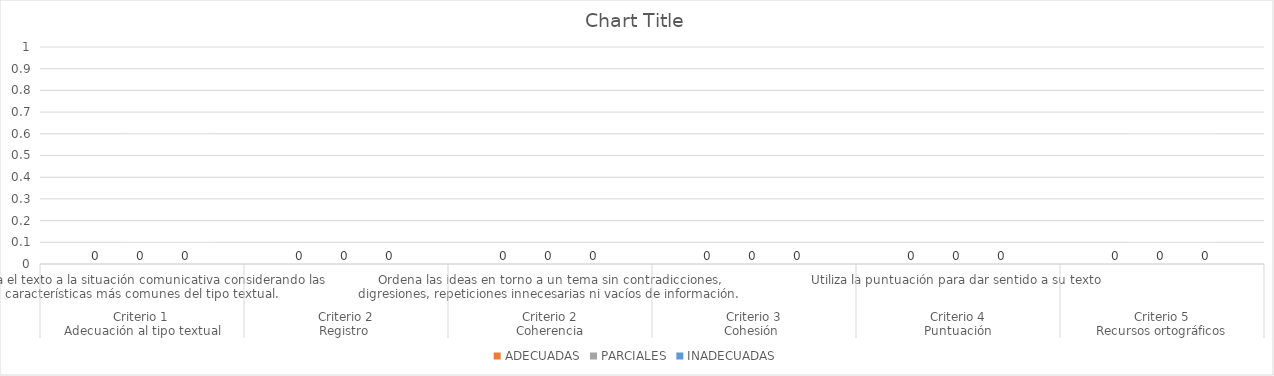
| Category | ADECUADAS | PARCIALES | INADECUADAS |
|---|---|---|---|
| 0 | 0 | 0 | 0 |
| 1 | 0 | 0 | 0 |
| 2 | 0 | 0 | 0 |
| 3 | 0 | 0 | 0 |
| 4 | 0 | 0 | 0 |
| 5 | 0 | 0 | 0 |